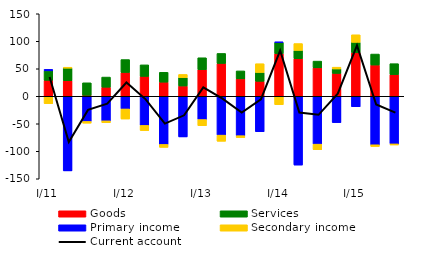
| Category | Goods | Services | Primary income | Secondary income |
|---|---|---|---|---|
| I/11 | 28.994 | 17.24 | 2.716 | -13.37 |
| II | 28.218 | 22.874 | -135.675 | 1.741 |
| III | 1.774 | 22.739 | -45.729 | -3.187 |
| IV | 16.492 | 18.43 | -44.657 | -3.399 |
| I/12 | 43.281 | 23.478 | -23.083 | -18.258 |
| II | 36.152 | 20.972 | -52.981 | -9.36 |
| III | 25.681 | 17.923 | -87.565 | -5.364 |
| IV | 18.683 | 15.252 | -73.899 | 5.772 |
| I/13 | 48.355 | 21.702 | -42.281 | -11.28 |
| II | 59.692 | 18.186 | -70.624 | -11.218 |
| III | 31.672 | 14.458 | -71.638 | -3.56 |
| IV | 27.254 | 16.013 | -64.475 | 15.96 |
| I/14 | 77.394 | 20.418 | 1.008 | -15.254 |
| II | 68.219 | 15.152 | -125.09 | 12.495 |
| III | 51.694 | 12.235 | -87.004 | -10.21 |
| IV | 41.587 | 8.072 | -47.876 | 3.26 |
| I/15 | 79.393 | 18.663 | -19.091 | 13.764 |
| II | 56.811 | 19.952 | -88.179 | -3.184 |
| III | 39.418 | 19.868 | -86.57 | -2.002 |